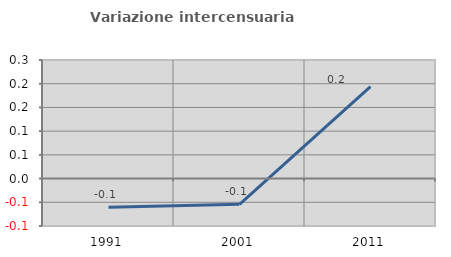
| Category | Variazione intercensuaria annua |
|---|---|
| 1991.0 | -0.06 |
| 2001.0 | -0.054 |
| 2011.0 | 0.194 |